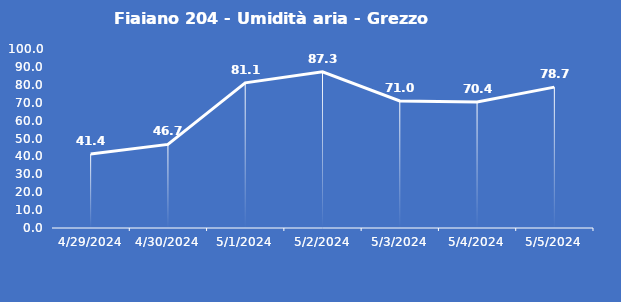
| Category | Fiaiano 204 - Umidità aria - Grezzo (%) |
|---|---|
| 4/29/24 | 41.4 |
| 4/30/24 | 46.7 |
| 5/1/24 | 81.1 |
| 5/2/24 | 87.3 |
| 5/3/24 | 71 |
| 5/4/24 | 70.4 |
| 5/5/24 | 78.7 |